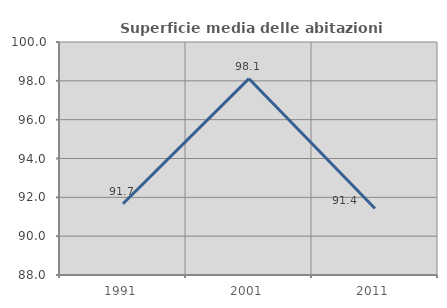
| Category | Superficie media delle abitazioni occupate |
|---|---|
| 1991.0 | 91.669 |
| 2001.0 | 98.111 |
| 2011.0 | 91.421 |